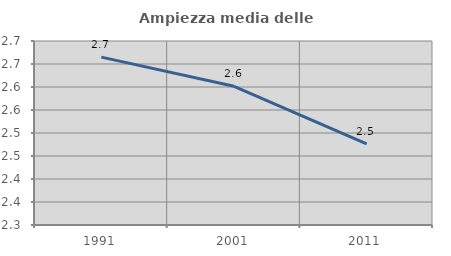
| Category | Ampiezza media delle famiglie |
|---|---|
| 1991.0 | 2.665 |
| 2001.0 | 2.602 |
| 2011.0 | 2.477 |